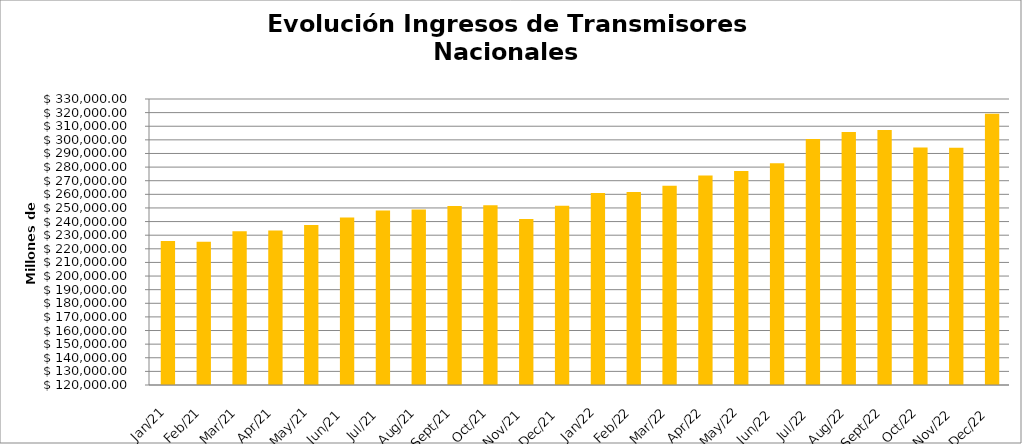
| Category | Series 0 |
|---|---|
| 2021-01-01 | 225666.784 |
| 2021-02-01 | 225240.916 |
| 2021-03-01 | 232828.219 |
| 2021-04-01 | 233395.779 |
| 2021-05-01 | 237413.151 |
| 2021-06-01 | 243066.289 |
| 2021-07-01 | 248080.997 |
| 2021-08-01 | 248951.544 |
| 2021-09-01 | 251354.555 |
| 2021-10-01 | 251927.267 |
| 2021-11-01 | 241952.729 |
| 2021-12-01 | 251642.78 |
| 2022-01-01 | 260998.425 |
| 2022-02-01 | 261795.689 |
| 2022-03-01 | 266330.52 |
| 2022-04-01 | 273839.05 |
| 2022-05-01 | 277053.786 |
| 2022-06-01 | 282824.369 |
| 2022-07-01 | 300671.353 |
| 2022-08-01 | 305815.266 |
| 2022-09-01 | 307204.28 |
| 2022-10-01 | 294374.785 |
| 2022-11-01 | 294285.468 |
| 2022-12-01 | 319144.864 |